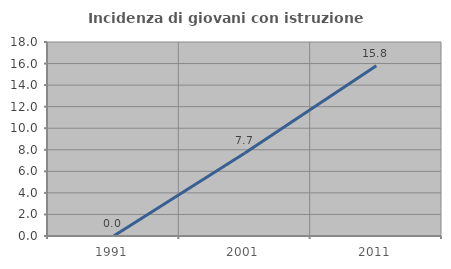
| Category | Incidenza di giovani con istruzione universitaria |
|---|---|
| 1991.0 | 0 |
| 2001.0 | 7.692 |
| 2011.0 | 15.789 |